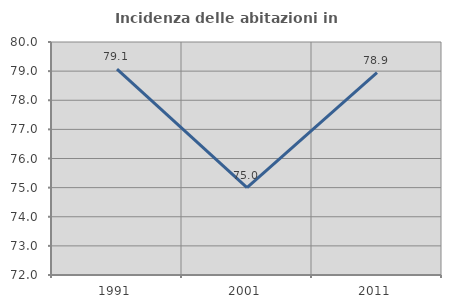
| Category | Incidenza delle abitazioni in proprietà  |
|---|---|
| 1991.0 | 79.07 |
| 2001.0 | 75 |
| 2011.0 | 78.947 |